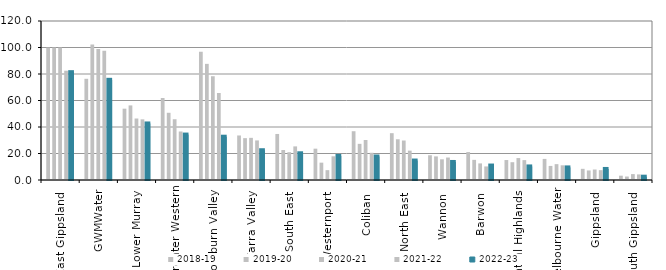
| Category | 2018-19 | 2019-20 | 2020-21 | 2021-22 | 2022-23 |
|---|---|---|---|---|---|
| East Gippsland  | 100 | 100 | 100 | 82.474 | 81.381 |
| GWMWater | 76.377 | 102.331 | 98.946 | 97.598 | 75.616 |
| Lower Murray  | 53.818 | 56.288 | 46.409 | 45.769 | 42.674 |
| Greater Western | 61.907 | 50.724 | 45.858 | 36.605 | 34.291 |
| Goulburn Valley  | 96.817 | 87.65 | 78.313 | 65.683 | 32.673 |
| Yarra Valley  | 33.607 | 31.588 | 31.811 | 29.872 | 22.468 |
| South East  | 34.743 | 22.613 | 20.97 | 25.374 | 20.17 |
| Westernport  | 23.64 | 13.085 | 7.441 | 17.879 | 18.157 |
| Coliban  | 36.811 | 27.279 | 30.211 | 20.544 | 17.751 |
| North East  | 35.333 | 30.741 | 29.796 | 22.165 | 14.692 |
| Wannon  | 18.678 | 17.807 | 15.62 | 16.964 | 13.611 |
| Barwon  | 21.093 | 15.202 | 12.523 | 10.241 | 10.918 |
| Central Highlands  | 15.067 | 13.434 | 16.556 | 15.009 | 10.24 |
| Melbourne Water | 15.916 | 10.626 | 11.971 | 11.094 | 9.5 |
| Gippsland  | 8.43 | 7.207 | 7.919 | 7.421 | 8.332 |
| South Gippsland  | 3.257 | 2.617 | 4.45 | 4.21 | 2.502 |